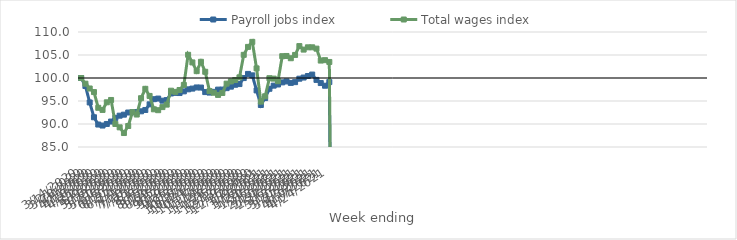
| Category | Payroll jobs index | Total wages index |
|---|---|---|
| 14/03/2020 | 100 | 100 |
| 21/03/2020 | 98.264 | 98.765 |
| 28/03/2020 | 94.681 | 97.719 |
| 04/04/2020 | 91.465 | 96.94 |
| 11/04/2020 | 89.882 | 93.523 |
| 18/04/2020 | 89.664 | 93.06 |
| 25/04/2020 | 90.007 | 94.717 |
| 02/05/2020 | 90.536 | 95.222 |
| 09/05/2020 | 91.33 | 90.004 |
| 16/05/2020 | 91.809 | 89.276 |
| 23/05/2020 | 92.031 | 88.037 |
| 30/05/2020 | 92.494 | 89.568 |
| 06/06/2020 | 92.542 | 92.571 |
| 13/06/2020 | 92.606 | 92.055 |
| 20/06/2020 | 92.76 | 95.607 |
| 27/06/2020 | 93.049 | 97.649 |
| 04/07/2020 | 94.276 | 96.103 |
| 11/07/2020 | 95.396 | 93.194 |
| 18/07/2020 | 95.529 | 93.002 |
| 25/07/2020 | 95.068 | 93.672 |
| 01/08/2020 | 95.198 | 94.213 |
| 08/08/2020 | 96.634 | 97.241 |
| 15/08/2020 | 96.766 | 96.986 |
| 22/08/2020 | 96.732 | 97.394 |
| 29/08/2020 | 97.092 | 98.493 |
| 05/09/2020 | 97.534 | 105.048 |
| 12/09/2020 | 97.696 | 103.386 |
| 19/09/2020 | 97.944 | 101.489 |
| 26/09/2020 | 97.921 | 103.519 |
| 03/10/2020 | 96.936 | 101.349 |
| 10/10/2020 | 96.828 | 97.151 |
| 17/10/2020 | 96.99 | 96.794 |
| 24/10/2020 | 97.476 | 96.323 |
| 31/10/2020 | 97.484 | 96.749 |
| 07/11/2020 | 97.795 | 98.774 |
| 14/11/2020 | 98.121 | 99.263 |
| 21/11/2020 | 98.527 | 99.559 |
| 28/11/2020 | 98.682 | 100.14 |
| 05/12/2020 | 99.983 | 105.037 |
| 12/12/2020 | 100.887 | 106.763 |
| 19/12/2020 | 100.576 | 107.855 |
| 26/12/2020 | 97.302 | 102.09 |
| 02/01/2021 | 94.131 | 94.87 |
| 09/01/2021 | 95.636 | 96.03 |
| 16/01/2021 | 97.658 | 99.958 |
| 23/01/2021 | 98.338 | 99.865 |
| 30/01/2021 | 98.589 | 99.306 |
| 06/02/2021 | 99.047 | 104.742 |
| 13/02/2021 | 99.25 | 104.788 |
| 20/02/2021 | 98.934 | 104.295 |
| 27/02/2021 | 99.103 | 105.017 |
| 06/03/2021 | 99.848 | 106.94 |
| 13/03/2021 | 100.1 | 106.174 |
| 20/03/2021 | 100.431 | 106.668 |
| 27/03/2021 | 100.745 | 106.674 |
| 03/04/2021 | 99.588 | 106.386 |
| 10/04/2021 | 98.902 | 103.79 |
| 17/04/2021 | 98.32 | 103.877 |
| 24/04/2021 | 99.111 | 103.487 |